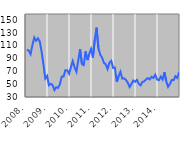
| Category | Series 0 |
|---|---|
| 2008. | 104.344 |
| 2  | 102.822 |
| 3  | 97.037 |
| 4  | 111.303 |
| 5  | 123.119 |
| 6  | 118.008 |
| 7  | 121.981 |
| 8  | 117.211 |
| 9  | 100.995 |
| 10  | 81.074 |
| 11  | 59.053 |
| 12  | 63.054 |
| 2009. | 48.356 |
| 2  | 50.714 |
| 3  | 48.73 |
| 4  | 40.837 |
| 5  | 45.264 |
| 6  | 44.295 |
| 7  | 50.264 |
| 8  | 61.943 |
| 9  | 62.151 |
| 10  | 72.076 |
| 11  | 72.026 |
| 12  | 66.358 |
| 2010. | 76.661 |
| 2  | 86.254 |
| 3  | 76.441 |
| 4  | 69.538 |
| 5  | 87.178 |
| 6  | 104.957 |
| 7  | 81.622 |
| 8  | 79.905 |
| 9  | 101.461 |
| 10  | 87.848 |
| 11  | 97.599 |
| 12  | 105.307 |
| 2011. | 91.701 |
| 2  | 120.026 |
| 3  | 138.657 |
| 4  | 106.16 |
| 5  | 96.17 |
| 6  | 91.749 |
| 7  | 83.556 |
| 8  | 81.17 |
| 9  | 73.779 |
| 10  | 83.618 |
| 11  | 86.675 |
| 12  | 75.629 |
| 2012. | 76.047 |
| 2  | 53.572 |
| 3  | 62.449 |
| 4  | 69.436 |
| 5  | 58.844 |
| 6  | 59.314 |
| 7  | 56.726 |
| 8  | 52.472 |
| 9  | 45.573 |
| 10  | 50.064 |
| 11  | 55.88 |
| 12  | 53.826 |
| 2013. | 56.811 |
| 2  | 50.738 |
| 3  | 48.235 |
| 4  | 53.617 |
| 5  | 54.513 |
| 6  | 57.735 |
| 7  | 59.592 |
| 8  | 57.513 |
| 9  | 61.704 |
| 10  | 59.899 |
| 11  | 64.848 |
| 12  | 57.44 |
| 2014. | 56.246 |
| 2  | 61.797 |
| 3  | 57.344 |
| 4  | 68.878 |
| 5  | 54.555 |
| 6  | 45.9 |
| 7  | 50.519 |
| 8  | 56.624 |
| 9  | 56.292 |
| 10  | 62.575 |
| 11  | 59.931 |
| 12  | 68.989 |